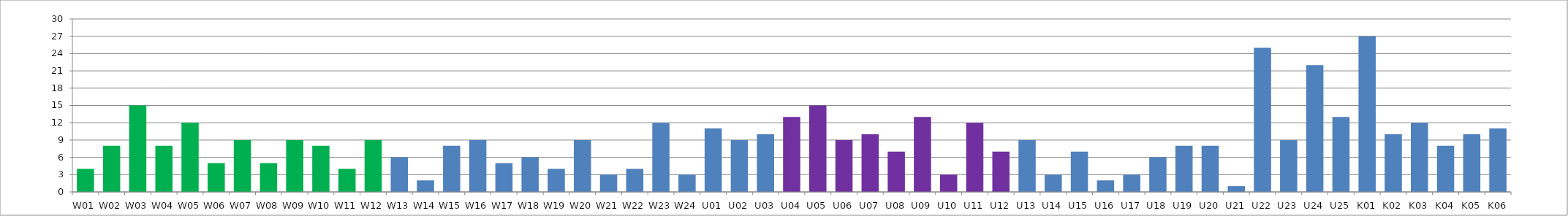
| Category | Series 0 |
|---|---|
| W01 | 4 |
| W02 | 8 |
| W03 | 15 |
| W04 | 8 |
| W05 | 12 |
| W06 | 5 |
| W07 | 9 |
| W08 | 5 |
| W09 | 9 |
| W10 | 8 |
| W11 | 4 |
| W12 | 9 |
| W13 | 6 |
| W14 | 2 |
| W15 | 8 |
| W16 | 9 |
| W17 | 5 |
| W18 | 6 |
| W19 | 4 |
| W20 | 9 |
| W21 | 3 |
| W22 | 4 |
| W23 | 12 |
| W24 | 3 |
| U01 | 11 |
| U02 | 9 |
| U03 | 10 |
| U04 | 13 |
| U05 | 15 |
| U06 | 9 |
| U07 | 10 |
| U08 | 7 |
| U09 | 13 |
| U10 | 3 |
| U11 | 12 |
| U12 | 7 |
| U13 | 9 |
| U14 | 3 |
| U15 | 7 |
| U16 | 2 |
| U17 | 3 |
| U18 | 6 |
| U19 | 8 |
| U20 | 8 |
| U21 | 1 |
| U22 | 25 |
| U23 | 9 |
| U24 | 22 |
| U25 | 13 |
| K01 | 27 |
| K02 | 10 |
| K03 | 12 |
| K04 | 8 |
| K05 | 10 |
| K06 | 11 |